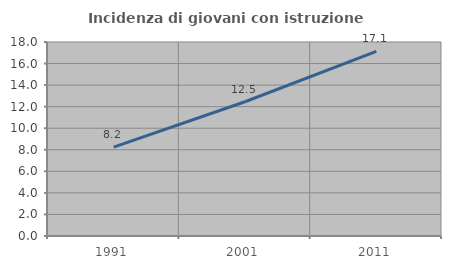
| Category | Incidenza di giovani con istruzione universitaria |
|---|---|
| 1991.0 | 8.244 |
| 2001.0 | 12.458 |
| 2011.0 | 17.131 |